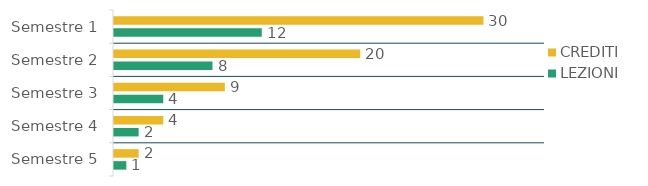
| Category | CREDITI  | LEZIONI  |
|---|---|---|
| Semestre 1 | 30 | 12 |
| Semestre 2 | 20 | 8 |
| Semestre 3 | 9 | 4 |
| Semestre 4 | 4 | 2 |
| Semestre 5 | 2 | 1 |